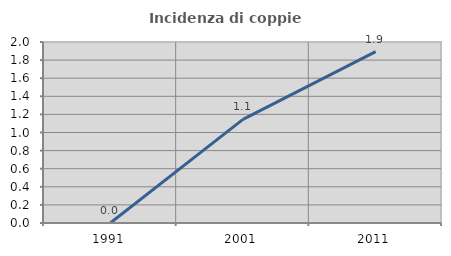
| Category | Incidenza di coppie miste |
|---|---|
| 1991.0 | 0 |
| 2001.0 | 1.145 |
| 2011.0 | 1.894 |